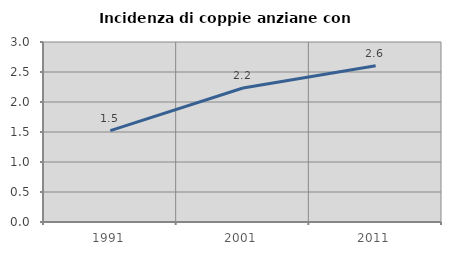
| Category | Incidenza di coppie anziane con figli |
|---|---|
| 1991.0 | 1.524 |
| 2001.0 | 2.232 |
| 2011.0 | 2.605 |